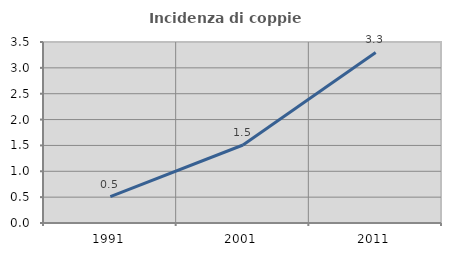
| Category | Incidenza di coppie miste |
|---|---|
| 1991.0 | 0.51 |
| 2001.0 | 1.508 |
| 2011.0 | 3.297 |